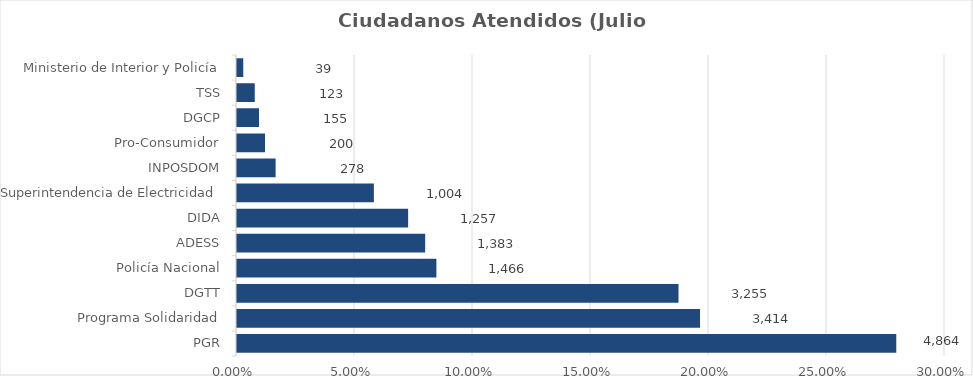
| Category | Porcentaje |
|---|---|
| PGR | 0.279 |
| Programa Solidaridad | 0.196 |
| DGTT | 0.187 |
| Policía Nacional | 0.084 |
| ADESS | 0.079 |
| DIDA | 0.072 |
| Superintendencia de Electricidad | 0.058 |
| INPOSDOM | 0.016 |
| Pro-Consumidor | 0.011 |
| DGCP | 0.009 |
| TSS | 0.007 |
| Ministerio de Interior y Policía | 0.002 |